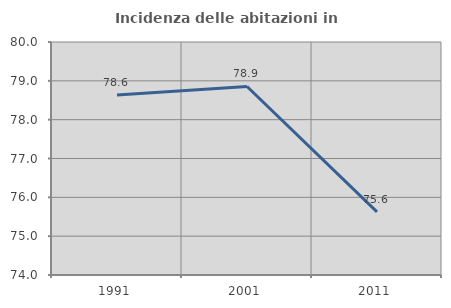
| Category | Incidenza delle abitazioni in proprietà  |
|---|---|
| 1991.0 | 78.636 |
| 2001.0 | 78.855 |
| 2011.0 | 75.625 |